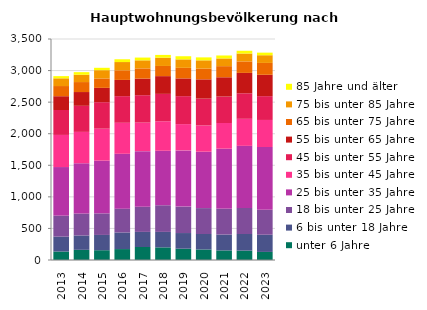
| Category | unter 6 Jahre | 6 bis unter 18 Jahre | 18 bis unter 25 Jahre | 25 bis unter 35 Jahre | 35 bis unter 45 Jahre | 45 bis unter 55 Jahre | 55 bis unter 65 Jahre | 65 bis unter 75 Jahre | 75 bis unter 85 Jahre | 85 Jahre und älter |
|---|---|---|---|---|---|---|---|---|---|---|
| 2013.0 | 134 | 236 | 332 | 770 | 509 | 395 | 218 | 161 | 122 | 35 |
| 2014.0 | 161 | 227 | 347 | 797 | 497 | 413 | 218 | 158 | 116 | 41 |
| 2015.0 | 155 | 242 | 341 | 836 | 506 | 419 | 227 | 149 | 131 | 38 |
| 2016.0 | 173 | 263 | 377 | 869 | 491 | 422 | 257 | 152 | 131 | 44 |
| 2017.0 | 206 | 239 | 398 | 881 | 452 | 434 | 263 | 161 | 128 | 44 |
| 2018.0 | 200 | 245 | 422 | 863 | 467 | 434 | 281 | 161 | 131 | 44 |
| 2019.0 | 179 | 248 | 419 | 890 | 416 | 443 | 281 | 167 | 134 | 50 |
| 2020.0 | 167 | 245 | 410 | 893 | 416 | 425 | 305 | 170 | 131 | 47 |
| 2021.0 | 152 | 251 | 410 | 950 | 407 | 419 | 305 | 176 | 122 | 47 |
| 2022.0 | 149 | 263 | 413 | 983 | 428 | 404 | 323 | 182 | 125 | 44 |
| 2023.0 | 128 | 272 | 395 | 995 | 428 | 377 | 338 | 188 | 122 | 41 |